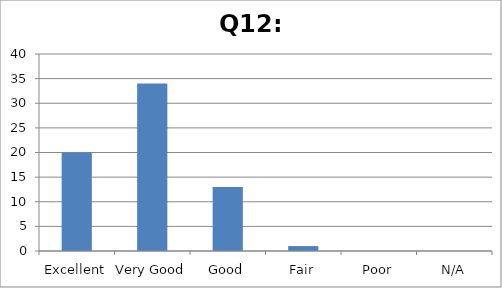
| Category | Response count |
|---|---|
| Excellent | 20 |
| Very Good | 34 |
| Good | 13 |
| Fair | 1 |
| Poor | 0 |
| N/A | 0 |